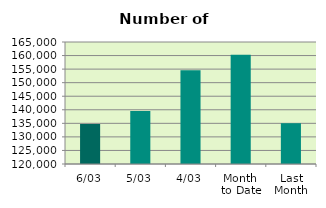
| Category | Series 0 |
|---|---|
| 6/03 | 134754 |
| 5/03 | 139508 |
| 4/03 | 154566 |
| Month 
to Date | 160324.5 |
| Last
Month | 135041.7 |